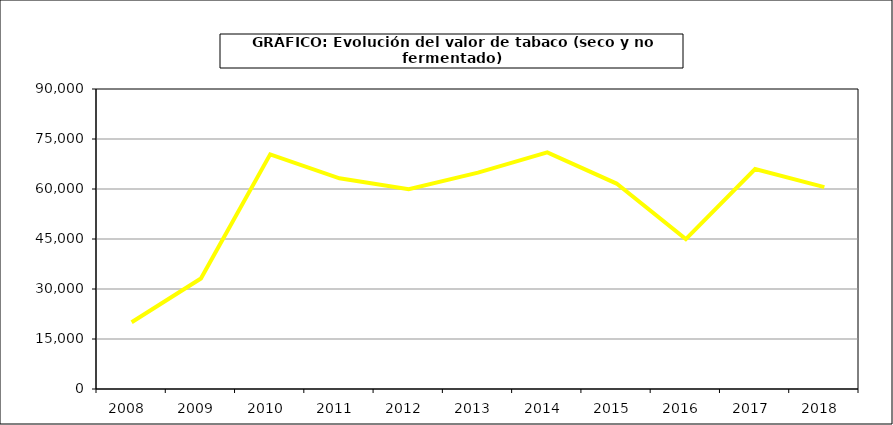
| Category | Valor |
|---|---|
| 2008.0 | 20011.548 |
| 2009.0 | 33141.373 |
| 2010.0 | 70384.847 |
| 2011.0 | 63219.669 |
| 2012.0 | 59963.648 |
| 2013.0 | 64900.043 |
| 2014.0 | 70983.122 |
| 2015.0 | 61634.5 |
| 2016.0 | 44972.9 |
| 2017.0 | 65979.385 |
| 2018.0 | 60574.168 |